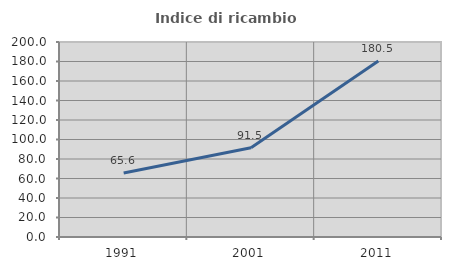
| Category | Indice di ricambio occupazionale  |
|---|---|
| 1991.0 | 65.634 |
| 2001.0 | 91.547 |
| 2011.0 | 180.514 |